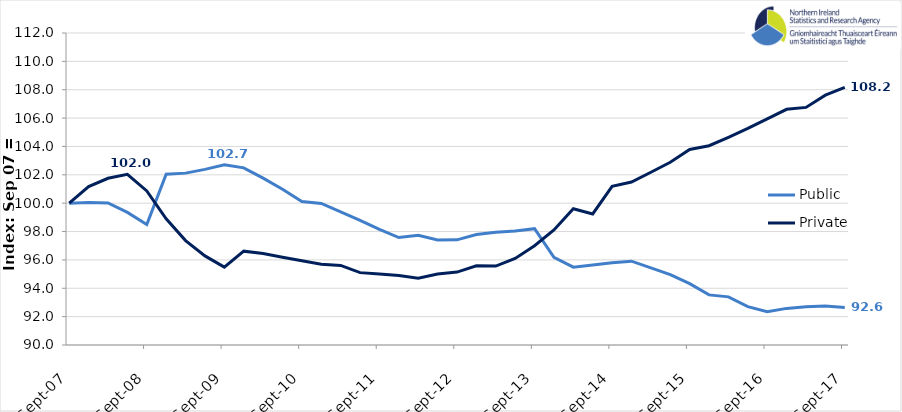
| Category | Public | Private |
|---|---|---|
| 2007-09-01 | 100 | 100 |
| 2007-12-01 | 100.052 | 101.171 |
| 2008-03-01 | 100.021 | 101.755 |
| 2008-06-01 | 99.349 | 102.036 |
| 2008-09-01 | 98.502 | 100.864 |
| 2008-12-01 | 102.045 | 98.896 |
| 2009-03-01 | 102.119 | 97.362 |
| 2009-06-01 | 102.384 | 96.282 |
| 2009-09-01 | 102.713 | 95.492 |
| 2009-12-01 | 102.489 | 96.617 |
| 2010-03-01 | 101.769 | 96.459 |
| 2010-06-01 | 100.987 | 96.191 |
| 2010-09-01 | 100.117 | 95.941 |
| 2010-12-01 | 99.98 | 95.693 |
| 2011-03-01 | 99.395 | 95.61 |
| 2011-06-01 | 98.795 | 95.103 |
| 2011-09-01 | 98.149 | 95.008 |
| 2011-12-01 | 97.579 | 94.899 |
| 2012-03-01 | 97.742 | 94.714 |
| 2012-06-01 | 97.412 | 95.001 |
| 2012-09-01 | 97.413 | 95.143 |
| 2012-12-01 | 97.791 | 95.591 |
| 2013-03-01 | 97.949 | 95.568 |
| 2013-06-01 | 98.04 | 96.101 |
| 2013-09-01 | 98.204 | 96.999 |
| 2013-12-01 | 96.173 | 98.109 |
| 2014-03-01 | 95.491 | 99.611 |
| 2014-06-01 | 95.636 | 99.243 |
| 2014-09-01 | 95.796 | 101.192 |
| 2014-12-01 | 95.909 | 101.491 |
| 2015-03-01 | 95.444 | 102.183 |
| 2015-06-01 | 94.958 | 102.888 |
| 2015-09-01 | 94.331 | 103.787 |
| 2015-12-01 | 93.534 | 104.054 |
| 2016-03-01 | 93.394 | 104.647 |
| 2016-06-01 | 92.705 | 105.272 |
| 2016-09-01 | 92.34 | 105.943 |
| 2016-12-01 | 92.582 | 106.62 |
| 2017-03-01 | 92.699 | 106.754 |
| 2017-06-01 | 92.747 | 107.62 |
| 2017-09-01 | 92.648 | 108.163 |